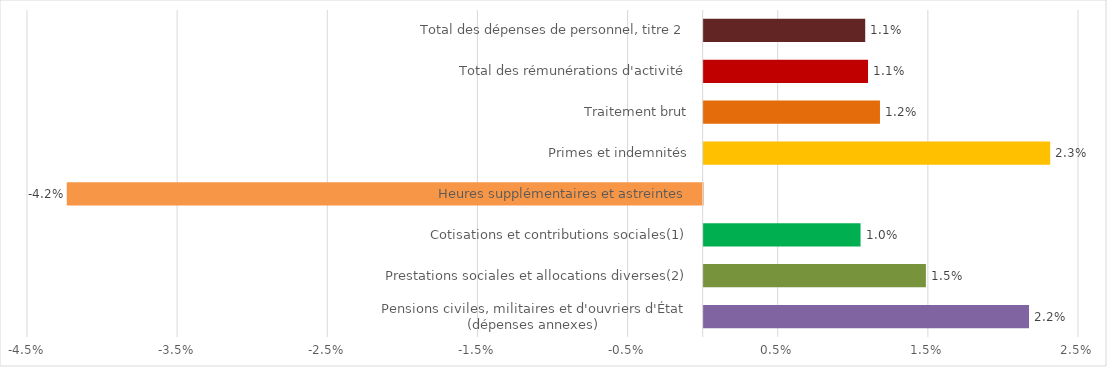
| Category | Évolution 2020/2019
(en %) |
|---|---|
| Pensions civiles, militaires et d'ouvriers d'État
(dépenses annexes) | 0.022 |
| Prestations sociales et allocations diverses(2) | 0.015 |
| Cotisations et contributions sociales(1) | 0.01 |
| Heures supplémentaires et astreintes | -0.042 |
| Primes et indemnités | 0.023 |
| Traitement brut | 0.012 |
| Total des rémunérations d'activité | 0.011 |
| Total des dépenses de personnel, titre 2 | 0.011 |